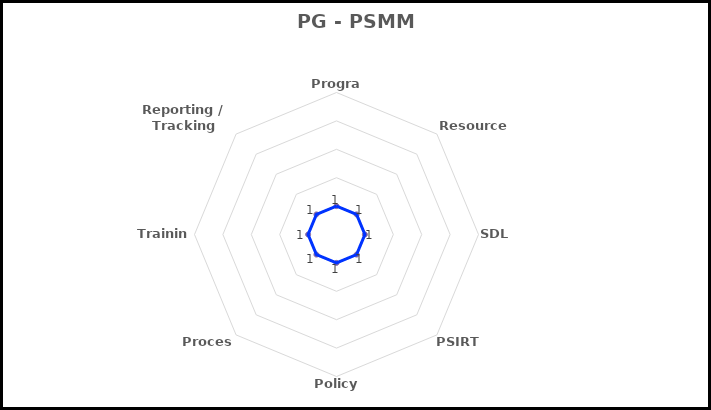
| Category | Series 3 |
|---|---|
| Program | 1 |
| Resources | 1 |
| SDL | 1 |
| PSIRT | 1 |
| Policy | 1 |
| Process | 1 |
| Training | 1 |
| Reporting / Tracking Tools | 1 |